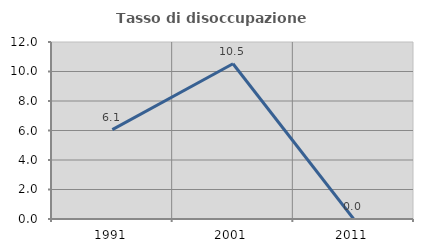
| Category | Tasso di disoccupazione giovanile  |
|---|---|
| 1991.0 | 6.061 |
| 2001.0 | 10.526 |
| 2011.0 | 0 |